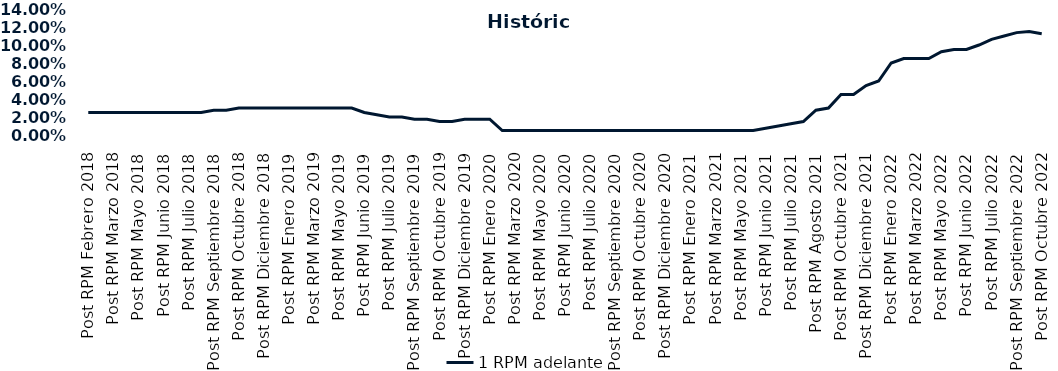
| Category | 1 RPM adelante |
|---|---|
| Post RPM Febrero 2018 | 0.025 |
| Pre RPM Marzo 2018 | 0.025 |
| Post RPM Marzo 2018 | 0.025 |
| Pre RPM Mayo 2018 | 0.025 |
| Post RPM Mayo 2018 | 0.025 |
| Pre RPM Junio 2018 | 0.025 |
| Post RPM Junio 2018 | 0.025 |
| Pre RPM Julio 2018 | 0.025 |
| Post RPM Julio 2018 | 0.025 |
| Pre RPM Septiembre 2018 | 0.025 |
| Post RPM Septiembre 2018 | 0.028 |
| Pre RPM Octubre 2018 | 0.028 |
| Post RPM Octubre 2018 | 0.03 |
| Pre RPM Diciembre 2018 | 0.03 |
| Post RPM Diciembre 2018 | 0.03 |
| Pre RPM Enero 2019 | 0.03 |
| Post RPM Enero 2019 | 0.03 |
| Pre RPM Marzo 2019 | 0.03 |
| Post RPM Marzo 2019 | 0.03 |
| Pre RPM Mayo 2019 | 0.03 |
| Post RPM Mayo 2019 | 0.03 |
| Pre RPM Junio 2019 | 0.03 |
| Post RPM Junio 2019 | 0.025 |
| Pre RPM Julio 2019 | 0.022 |
| Post RPM Julio 2019 | 0.02 |
| Pre RPM Septiembre 2019 | 0.02 |
| Post RPM Septiembre 2019 | 0.018 |
| Pre RPM Octubre 2019 | 0.018 |
| Post RPM Octubre 2019 | 0.015 |
| Pre RPM Diciembre 2019 | 0.015 |
| Post RPM Diciembre 2019 | 0.018 |
| Pre RPM Enero 2020 | 0.018 |
| Post RPM Enero 2020 | 0.018 |
| Pre RPM Marzo 2020 | 0.005 |
| Post RPM Marzo 2020 | 0.005 |
| Pre RPM Mayo 2020 | 0.005 |
| Post RPM Mayo 2020 | 0.005 |
| Pre RPM Junio 2020 | 0.005 |
| Post RPM Junio 2020 | 0.005 |
| Pre RPM Julio 2020 | 0.005 |
| Post RPM Julio 2020 | 0.005 |
| Pre RPM Septiembre 2020 | 0.005 |
| Post RPM Septiembre 2020 | 0.005 |
| Pre RPM Octubre 2020 | 0.005 |
| Post RPM Octubre 2020 | 0.005 |
| Pre RPM Diciembre 2020 | 0.005 |
| Post RPM Diciembre 2020 | 0.005 |
| Pre RPM Enero 2021 | 0.005 |
| Post RPM Enero 2021 | 0.005 |
| Pre RPM Marzo 2021 | 0.005 |
| Post RPM Marzo 2021 | 0.005 |
| Pre RPM Mayo 2021 | 0.005 |
| Post RPM Mayo 2021 | 0.005 |
| Pre RPM Junio 2021 | 0.005 |
| Post RPM Junio 2021 | 0.008 |
| Pre RPM Julio 2021 | 0.01 |
| Post RPM Julio 2021 | 0.012 |
| Pre RPM Agosto 2021 | 0.015 |
| Post RPM Agosto 2021 | 0.028 |
| Pre RPM Octubre 2021 | 0.03 |
| Post RPM Octubre 2021 | 0.045 |
| Pre RPM Diciembre 2021 | 0.045 |
| Post RPM Diciembre 2021 | 0.055 |
| Pre RPM Enero 2022 | 0.06 |
| Post RPM Enero 2022 | 0.08 |
| Pre RPM Marzo 2022 | 0.085 |
| Post RPM Marzo 2022 | 0.085 |
| Pre RPM Mayo 2022 | 0.085 |
| Post RPM Mayo 2022 | 0.092 |
| Pre RPM Junio 2022 | 0.095 |
| Post RPM Junio 2022 | 0.095 |
| Pre RPM Julio 2022 | 0.1 |
| Post RPM Julio 2022 | 0.106 |
| Pre RPM Septiembre 2022 | 0.11 |
| Post RPM Septiembre 2022 | 0.114 |
| Pre RPM Octubre 2022 | 0.115 |
| Post RPM Octubre 2022 | 0.112 |